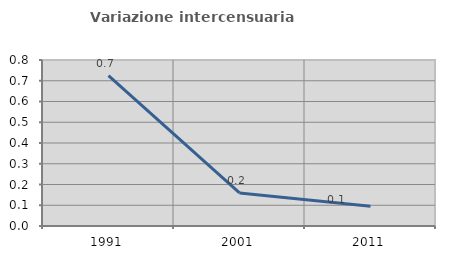
| Category | Variazione intercensuaria annua |
|---|---|
| 1991.0 | 0.725 |
| 2001.0 | 0.159 |
| 2011.0 | 0.095 |